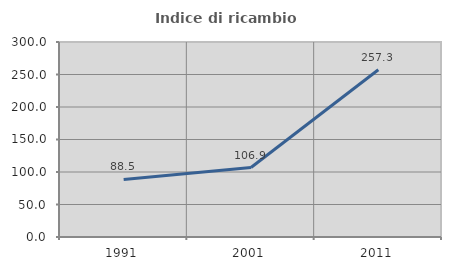
| Category | Indice di ricambio occupazionale  |
|---|---|
| 1991.0 | 88.525 |
| 2001.0 | 106.897 |
| 2011.0 | 257.265 |